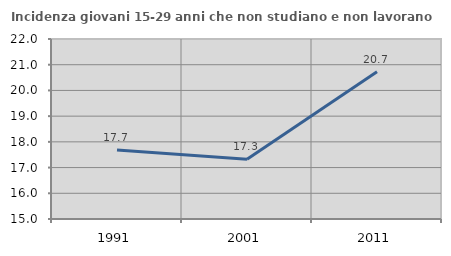
| Category | Incidenza giovani 15-29 anni che non studiano e non lavorano  |
|---|---|
| 1991.0 | 17.686 |
| 2001.0 | 17.32 |
| 2011.0 | 20.727 |